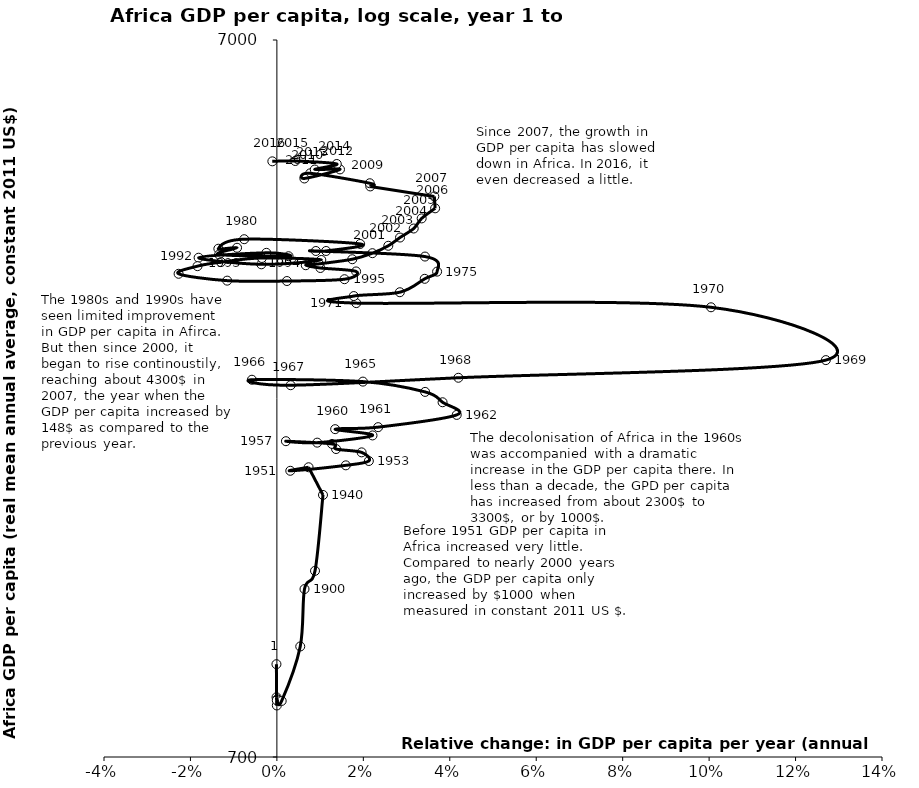
| Category | Series 0 |
|---|---|
| -0.00010084148512410944 | 943.075 |
| -8.282303812592678e-05 | 848.069 |
| -1.0579185191275126e-05 | 825.991 |
| 8.362364439008743e-05 | 842.686 |
| -2.493835849414254e-05 | 839.805 |
| 0.0011101361766955129 | 838.063 |
| 0.005404344649926629 | 998.296 |
| 0.00639158353597144 | 1200.397 |
| 0.008820917287990108 | 1272.665 |
| 0.010667853445816045 | 1623.941 |
| 0.007336755136086059 | 1775 |
| 0.0030985915492957746 | 1755 |
| 0.015954415954415956 | 1786 |
| 0.02127659574468085 | 1811 |
| 0.019602429596907785 | 1862 |
| 0.013694951664876477 | 1882 |
| 0.012752391073326248 | 1913 |
| 0.0020909566126502874 | 1930 |
| 0.00932642487046632 | 1921 |
| 0.022123893805309734 | 1966 |
| 0.01347914547304171 | 2006 |
| 0.023429710867397806 | 2019 |
| 0.041604754829123326 | 2100 |
| 0.03833333333333333 | 2187 |
| 0.03429355281207133 | 2261 |
| 0.019902697921273773 | 2337 |
| -0.005776636713735558 | 2351 |
| 0.0031901318587834963 | 2310 |
| 0.04199134199134199 | 2366 |
| 0.12700760777683853 | 2504 |
| 0.10043929712460063 | 2967 |
| 0.018368722615436466 | 3007 |
| 0.017791819088792817 | 3076 |
| 0.028446033810143042 | 3114 |
| 0.03420038535645472 | 3251 |
| 0.0370655183020609 | 3327 |
| 0.034265103697024346 | 3492 |
| 0.00902061855670103 | 3555 |
| 0.01139240506329114 | 3555 |
| 0.019268635724331927 | 3636 |
| -0.007563256325632563 | 3692 |
| -0.013542795232936078 | 3581 |
| -0.009215302987992181 | 3592 |
| -0.013363028953229399 | 3515 |
| 0.002702702702702703 | 3496 |
| -0.002431350114416476 | 3534 |
| -0.018109790605546124 | 3479 |
| -0.0035929864903707963 | 3406 |
| 0.010275983558426306 | 3454 |
| -0.003474232773595831 | 3476 |
| -0.012945914844649022 | 3430 |
| -0.018367346938775512 | 3386 |
| -0.022740696987595982 | 3304 |
| -0.011501210653753027 | 3232 |
| 0.0023205445544554454 | 3228 |
| 0.015644361833952913 | 3247 |
| 0.01832460732984293 | 3329 |
| 0.010063082006608591 | 3366 |
| 0.0066844919786096255 | 3396 |
| 0.009717314487632508 | 3411 |
| 0.01744356493696863 | 3462 |
| 0.022097053726169845 | 3530 |
| 0.025779036827195467 | 3615 |
| 0.028492392807745504 | 3712 |
| 0.03165409482758621 | 3821 |
| 0.033499084009421615 | 3947 |
| 0.03661008360780339 | 4077 |
| 0.03642384105960265 | 4236 |
| 0.02160056657223796 | 4374 |
| 0.021490626428898034 | 4419 |
| 0.007694048427245984 | 4562 |
| 0.006356861025865849 | 4487 |
| 0.014597726766213506 | 4620 |
| 0.008766233766233766 | 4618 |
| 0.013858813339107838 | 4701 |
| 0.0042544139544777706 | 4746 |
| -0.001053518752633797 | 4741 |